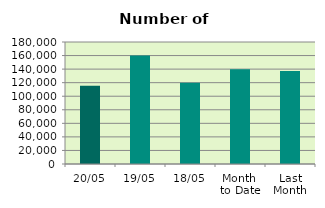
| Category | Series 0 |
|---|---|
| 20/05 | 115520 |
| 19/05 | 160146 |
| 18/05 | 119984 |
| Month 
to Date | 139712.857 |
| Last
Month | 137031.8 |